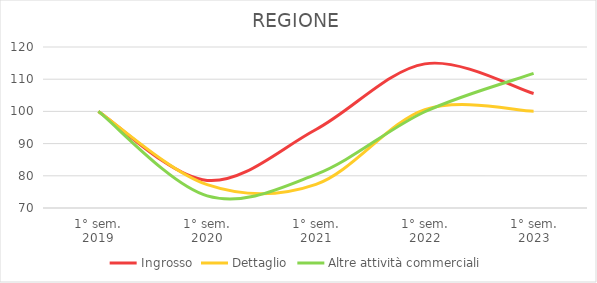
| Category | Ingrosso | Dettaglio | Altre attività commerciali |
|---|---|---|---|
| 1° sem.
2019 | 100 | 100 | 100 |
| 1° sem.
2020 | 78.568 | 77.255 | 73.776 |
| 1° sem.
2021 | 94.382 | 77.358 | 80.437 |
| 1° sem.
2022 | 114.755 | 100.532 | 99.888 |
| 1° sem.
2023 | 105.556 | 100.033 | 111.783 |